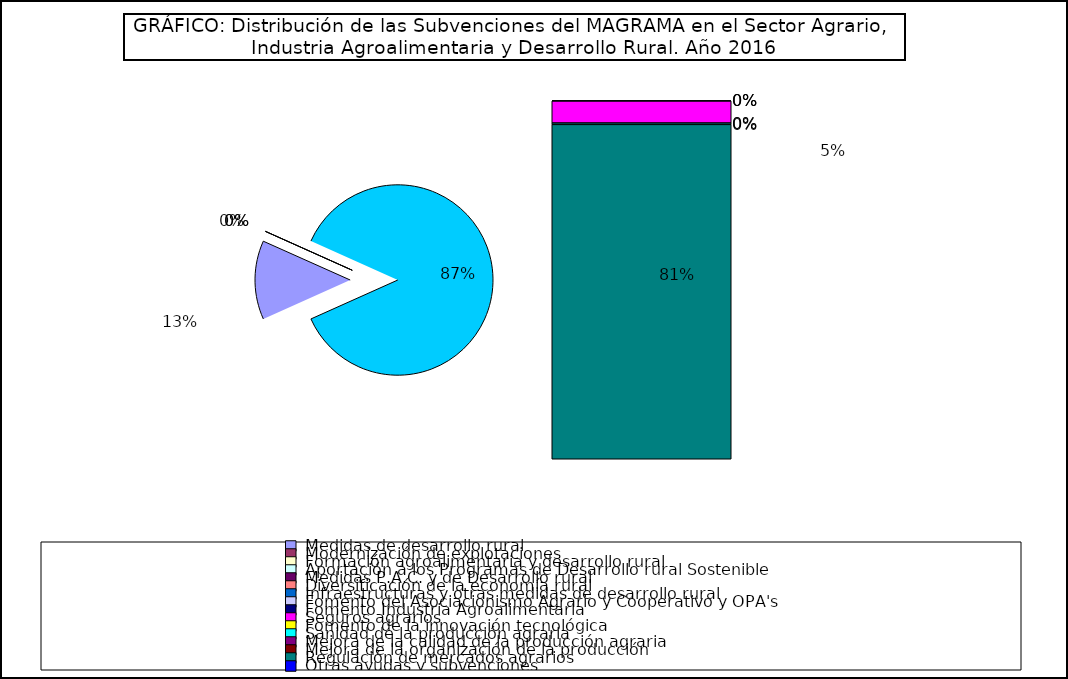
| Category | Series 0 |
|---|---|
|  Medidas de desarrollo rural | 957179.68 |
|  Modernización de explotaciones | 787.75 |
|  Formación agroalimentaria y desarrollo rural | 596.46 |
|  Aportación a los Programas de Desarrollo rural Sostenible | 0 |
|  Medidas P.A.C. y de Desarrollo rural | 0 |
|  Diversificación de la economía rural | 59.72 |
|  Infraestructuras y otras medidas de desarrollo rural | 50 |
|  Fomento del Asociacionismo Agrario y Cooperativo y OPA's | 2730.45 |
|  Fomento Industria Agroalimentaria  | 717.81 |
|  Seguros agrarios | 375567.12 |
|  Fomento de la innovación tecnológica  | 0 |
|  Sanidad de la producción agraria | 21218.05 |
|  Mejora de la calidad de la producción agraria | 5532.3 |
|  Mejora de la organización de la producción | 2453.61 |
|  Regulación de mercados agrarios | 5779829.33 |
|  Otras ayudas y subvenciones | 0 |